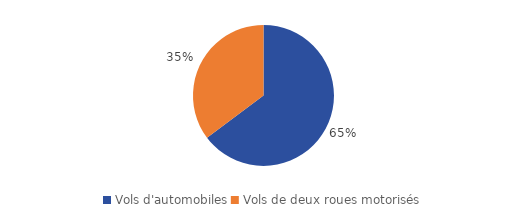
| Category | Series 0 |
|---|---|
| Vols d'automobiles | 79300 |
| Vols de deux roues motorisés | 43100 |